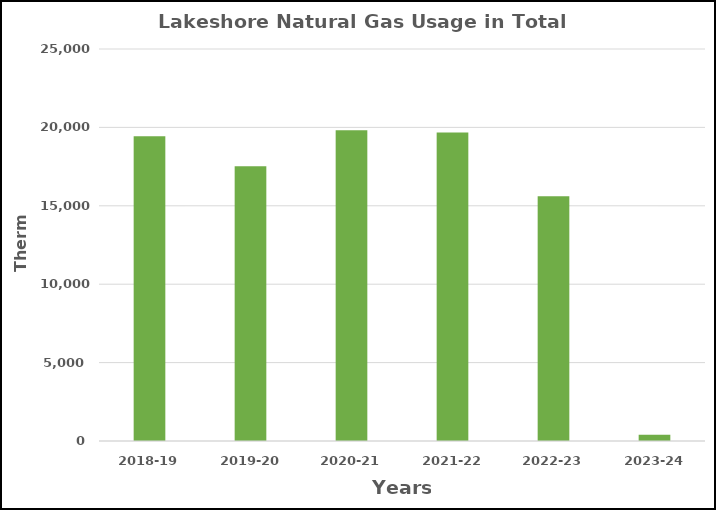
| Category | Series 0 |
|---|---|
| 2018-19 | 19441 |
| 2019-20 | 17530 |
| 2020-21 | 19813 |
| 2021-22 | 19681 |
| 2022-23 | 15606 |
| 2023-24 | 397 |